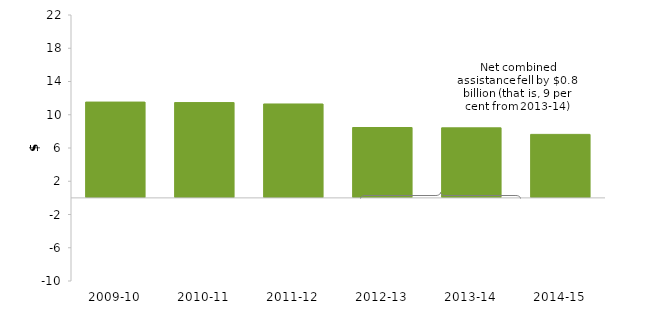
| Category | Net combined assistance |
|---|---|
| 2009-10 | 11.525 |
| 2010-11 | 11.465 |
| 2011-12 | 11.296 |
| 2012-13 | 8.465 |
| 2013-14 | 8.426 |
| 2014-15 | 7.638 |